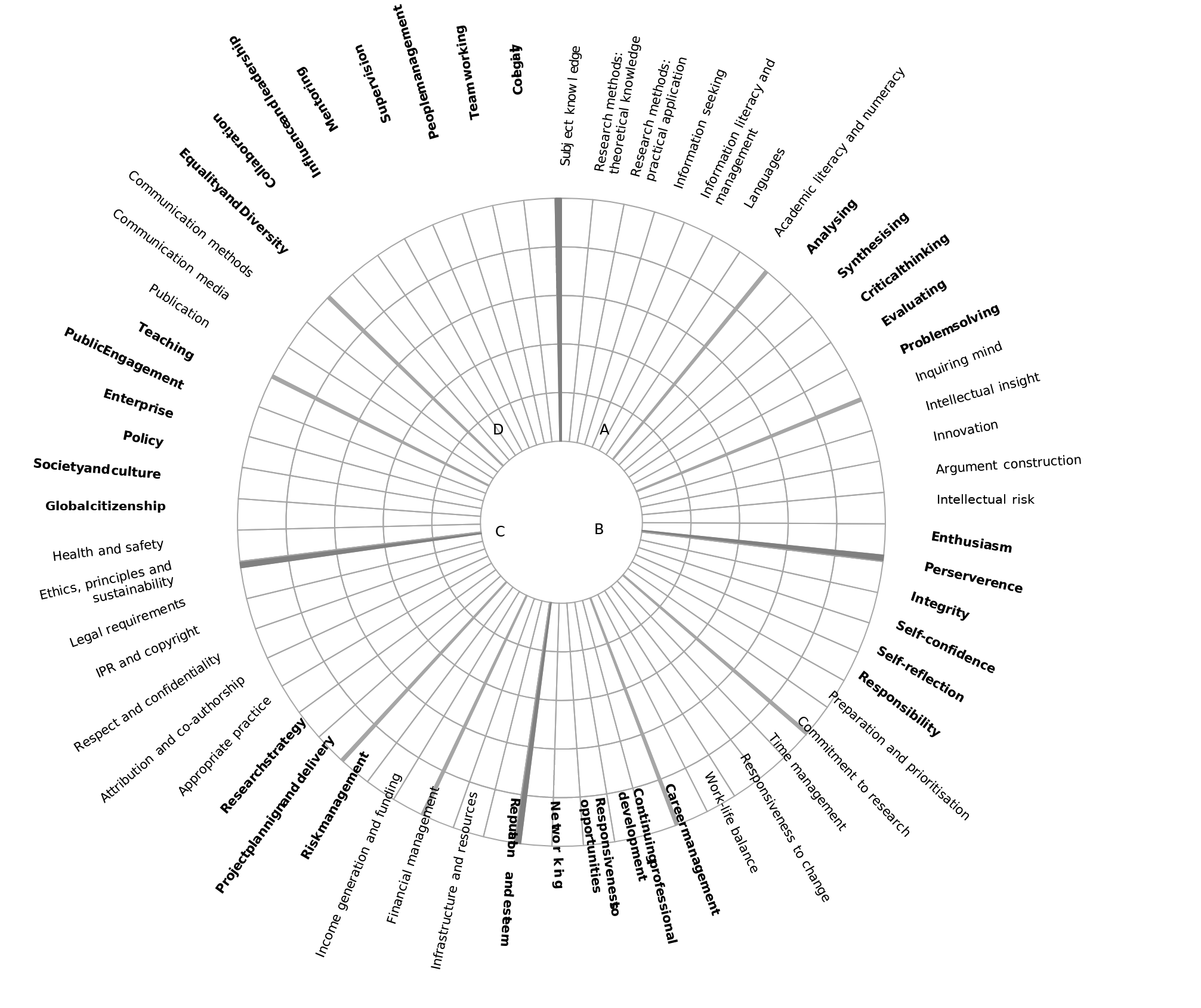
| Category | Series 0 | Series 1 | Series 2 | Series 3 | Series 4 |
|---|---|---|---|---|---|
| Subject knowledge | 0 | 0 | 0 | 0 | 0 |
| Subject knowledge | 10 | 10 | 10 | 10 | 10 |
| Research methods - theoretical knowledge | 0 | 0 | 0 | 0 | 0 |
| Research methods - theoretical knowledge | 10 | 10 | 10 | 10 | 10 |
| Research methods - practical application | 0 | 0 | 0 | 0 | 0 |
| Research methods - practical application | 10 | 10 | 10 | 10 | 10 |
| Information seeking | 0 | 0 | 0 | 0 | 0 |
| Information seeking | 10 | 10 | 10 | 10 | 10 |
| Information literacy and management | 0 | 0 | 0 | 0 | 0 |
| Information literacy and management | 10 | 10 | 10 | 10 | 10 |
| Languages | 0 | 0 | 0 | 0 | 0 |
| Languages | 10 | 10 | 10 | 10 | 10 |
| Academic literacy and numeracy | 0 | 0 | 0 | 0 | 0 |
| Academic literacy and numeracy | 10 | 10 | 10 | 10 | 10 |
| Blank | 1 | 1 | 1 | 1 | 1 |
| Analysing | 0 | 0 | 0 | 0 | 0 |
| Analysing | 10 | 10 | 10 | 10 | 10 |
| Synthesising | 0 | 0 | 0 | 0 | 0 |
| Synthesising | 10 | 10 | 10 | 10 | 10 |
| Critical thinking | 0 | 0 | 0 | 0 | 0 |
| Critical thinking | 10 | 10 | 10 | 10 | 10 |
| Evaluating | 0 | 0 | 0 | 0 | 0 |
| Evaluating | 10 | 10 | 10 | 10 | 10 |
| Problem solving | 0 | 0 | 0 | 0 | 0 |
| Problem solving | 10 | 10 | 10 | 10 | 10 |
| blank | 1 | 1 | 1 | 1 | 1 |
| Inquiring mind | 0 | 0 | 0 | 0 | 0 |
| Inquiring mind | 10 | 10 | 10 | 10 | 10 |
| Intellectual insight | 0 | 0 | 0 | 0 | 0 |
| Intellectual insight | 10 | 10 | 10 | 10 | 10 |
| Innovation | 0 | 0 | 0 | 0 | 0 |
| Innovation | 10 | 10 | 10 | 10 | 10 |
| Argument construction | 0 | 0 | 0 | 0 | 0 |
| Argument construction | 10 | 10 | 10 | 10 | 10 |
| Intellectual risk | 0 | 0 | 0 | 0 | 0 |
| Intellectual risk | 10 | 10 | 10 | 10 | 10 |
| blank | 2 | 2 | 2 | 2 | 2 |
| Enthusiasm | 0 | 0 | 0 | 0 | 0 |
| Enthusiasm | 10 | 10 | 10 | 10 | 10 |
| Perseverance | 0 | 0 | 0 | 0 | 0 |
| Perseverance | 10 | 10 | 10 | 10 | 10 |
| Integrity | 0 | 0 | 0 | 0 | 0 |
| Integrity | 10 | 10 | 10 | 10 | 10 |
| Self-confidence | 0 | 0 | 0 | 0 | 0 |
| Self-confidence | 10 | 10 | 10 | 10 | 10 |
| Self-reflection | 0 | 0 | 0 | 0 | 0 |
| Self-reflection | 10 | 10 | 10 | 10 | 10 |
| Responsibility | 0 | 0 | 0 | 0 | 0 |
| Responsibility | 10 | 10 | 10 | 10 | 10 |
| Blank | 1 | 1 | 1 | 1 | 1 |
| Preparation and prioritisation | 0 | 0 | 0 | 0 | 0 |
| Preparation and prioritisation | 10 | 10 | 10 | 10 | 10 |
| Commitment to research | 0 | 0 | 0 | 0 | 0 |
| Commitment to research | 10 | 10 | 10 | 10 | 10 |
| Time management | 0 | 0 | 0 | 0 | 0 |
| Time management | 10 | 10 | 10 | 10 | 10 |
| Responsiveness to change | 0 | 0 | 0 | 0 | 0 |
| Responsiveness to change | 10 | 10 | 10 | 10 | 10 |
| Work-life balance | 0 | 0 | 0 | 0 | 0 |
| Work-life balance | 10 | 10 | 10 | 10 | 10 |
| blank | 1 | 1 | 1 | 1 | 1 |
| Career management | 0 | 0 | 0 | 0 | 0 |
| Career management | 10 | 10 | 10 | 10 | 10 |
| Continuing professional development | 0 | 0 | 0 | 0 | 0 |
| Continuing professional development | 10 | 10 | 10 | 10 | 10 |
| Responsiveness to opportunities | 0 | 0 | 0 | 0 | 0 |
| Responsiveness to opportunities | 10 | 10 | 10 | 10 | 10 |
| Networking | 0 | 0 | 0 | 0 | 0 |
| Networking | 10 | 10 | 10 | 10 | 10 |
| Reputation and esteem | 0 | 0 | 0 | 0 | 0 |
| Reputation and esteem | 10 | 10 | 10 | 10 | 10 |
| blank | 2 | 2 | 2 | 2 | 2 |
| Infrastructure and resources | 0 | 0 | 0 | 0 | 0 |
| Infrastructure and resources | 10 | 10 | 10 | 10 | 10 |
| Financial management | 0 | 0 | 0 | 0 | 0 |
| Financial management | 10 | 10 | 10 | 10 | 10 |
| Income and funding generation | 0 | 0 | 0 | 0 | 0 |
| Income and funding generation | 10 | 10 | 10 | 10 | 10 |
| blank | 1 | 1 | 1 | 1 | 1 |
| Risk management | 0 | 0 | 0 | 0 | 0 |
| Risk management | 10 | 10 | 10 | 10 | 10 |
| Project planning and delivery | 0 | 0 | 0 | 0 | 0 |
| Project planning and delivery | 10 | 10 | 10 | 10 | 10 |
| Research strategy | 0 | 0 | 0 | 0 | 0 |
| Research strategy | 10 | 10 | 10 | 10 | 10 |
| blank | 1 | 1 | 1 | 1 | 1 |
| Appropriate practice | 0 | 0 | 0 | 0 | 0 |
| Appropriate practice | 10 | 10 | 10 | 10 | 10 |
| Attribution and co-authorship | 0 | 0 | 0 | 0 | 0 |
| Attribution and co-authorship | 10 | 10 | 10 | 10 | 10 |
| Respect and confidentiality | 0 | 0 | 0 | 0 | 0 |
| Respect and confidentiality | 10 | 10 | 10 | 10 | 10 |
| IPR and copyright | 0 | 0 | 0 | 0 | 0 |
| IPR and copyright | 10 | 10 | 10 | 10 | 10 |
| Legal requirements | 0 | 0 | 0 | 0 | 0 |
| Legal requirements | 10 | 10 | 10 | 10 | 10 |
| Ethics, principles and sustainability | 0 | 0 | 0 | 0 | 0 |
| Ethics, principles and sustainability | 10 | 10 | 10 | 10 | 10 |
| Health and safety | 0 | 0 | 0 | 0 | 0 |
| Health and safety | 10 | 10 | 10 | 10 | 10 |
| blank | 2 | 2 | 2 | 2 | 2 |
| Global citizenship | 0 | 0 | 0 | 0 | 0 |
| Global citizenship | 10 | 10 | 10 | 10 | 10 |
| Society and culture | 0 | 0 | 0 | 0 | 0 |
| Society and culture | 10 | 10 | 10 | 10 | 10 |
| Policy | 0 | 0 | 0 | 0 | 0 |
| Policy | 10 | 10 | 10 | 10 | 10 |
| Enterprise | 0 | 0 | 0 | 0 | 0 |
| Enterprise | 10 | 10 | 10 | 10 | 10 |
| Public engagement | 0 | 0 | 0 | 0 | 0 |
| Public engagement | 10 | 10 | 10 | 10 | 10 |
| Teaching | 0 | 0 | 0 | 0 | 0 |
| Teaching | 10 | 10 | 10 | 10 | 10 |
| blank | 1 | 1 | 1 | 1 | 1 |
| Publication | 0 | 0 | 0 | 0 | 0 |
| Publication | 10 | 10 | 10 | 10 | 10 |
| Communication media | 0 | 0 | 0 | 0 | 0 |
| Communication media | 10 | 10 | 10 | 10 | 10 |
| Communication methods | 0 | 0 | 0 | 0 | 0 |
| Communication methods | 10 | 10 | 10 | 10 | 10 |
| blank | 1 | 1 | 1 | 1 | 1 |
| Equality and diversity | 0 | 0 | 0 | 0 | 0 |
| Equality and diversity | 10 | 10 | 10 | 10 | 10 |
| Collaboration | 0 | 0 | 0 | 0 | 0 |
| Collaboration | 10 | 10 | 10 | 10 | 10 |
| Influence and leadership | 0 | 0 | 0 | 0 | 0 |
| Influence and leadership | 10 | 10 | 10 | 10 | 10 |
| Mentoring | 0 | 0 | 0 | 0 | 0 |
| Mentoring | 10 | 10 | 10 | 10 | 10 |
| Supervision | 0 | 0 | 0 | 0 | 0 |
| Supervision | 10 | 10 | 10 | 10 | 10 |
| People management | 0 | 0 | 0 | 0 | 0 |
| People management | 10 | 10 | 10 | 10 | 10 |
| Team working | 0 | 0 | 0 | 0 | 0 |
| Team working | 10 | 10 | 10 | 10 | 10 |
| Collegiality | 0 | 0 | 0 | 0 | 0 |
| Collegiality | 10 | 10 | 10 | 10 | 10 |
| blank | 2 | 2 | 2 | 2 | 2 |